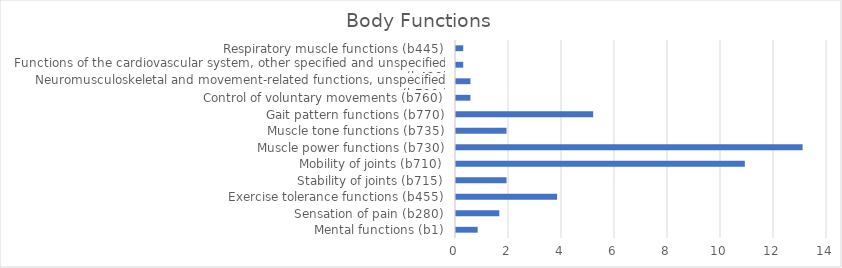
| Category | Series 0 |
|---|---|
| Mental functions (b1) | 0.817 |
| Sensation of pain (b280) | 1.635 |
| Exercise tolerance functions (b455) | 3.815 |
| Stability of joints (b715) | 1.907 |
| Mobility of joints (b710) | 10.899 |
| Muscle power functions (b730) | 13.079 |
| Muscle tone functions (b735) | 1.907 |
| Gait pattern functions (b770) | 5.177 |
| Control of voluntary movements (b760) | 0.545 |
| Neuromusculoskeletal and movement-related functions, unspecified (b799 ) | 0.545 |
| Functions of the cardiovascular system, other specified and unspecified (b429) | 0.272 |
| Respiratory muscle functions (b445) | 0.272 |